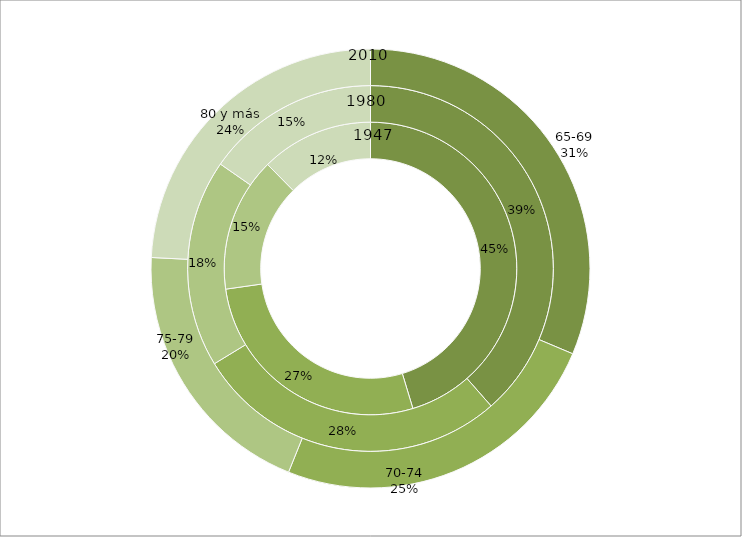
| Category | 1947 | 1980 | 2010 |
|---|---|---|---|
| 65-69 | 86332 | 344426 | 524011 |
| 70-74 | 52239 | 247919 | 413393 |
| 75-79 | 28260 | 164339 | 329396 |
| 80 y más | 23657 | 136961 | 404456 |